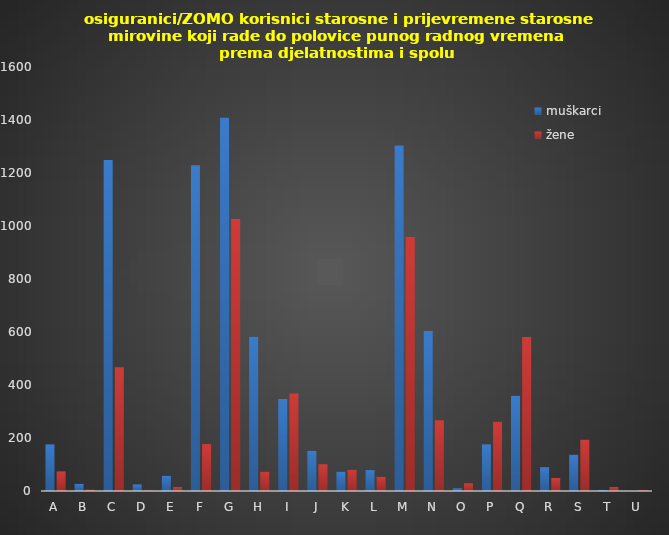
| Category | muškarci | žene |
|---|---|---|
| A | 176 | 74 |
| B | 27 | 5 |
| C | 1249 | 467 |
| D | 25 | 1 |
| E | 57 | 15 |
| F | 1229 | 177 |
| G | 1409 | 1026 |
| H | 583 | 73 |
| I | 347 | 368 |
| J | 152 | 101 |
| K | 73 | 81 |
| L | 79 | 54 |
| M | 1304 | 959 |
| N | 604 | 267 |
| O | 10 | 29 |
| P | 176 | 262 |
| Q | 359 | 581 |
| R | 90 | 49 |
| S | 137 | 194 |
| T | 3 | 15 |
| U | 0 | 2 |